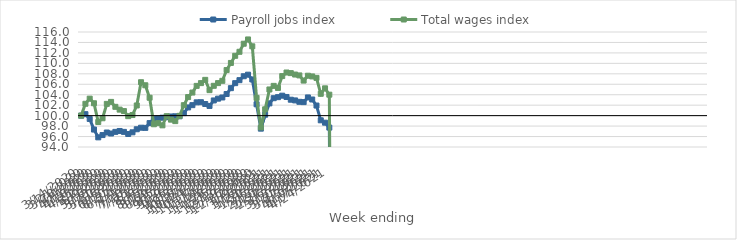
| Category | Payroll jobs index | Total wages index |
|---|---|---|
| 14/03/2020 | 100 | 100 |
| 21/03/2020 | 100.282 | 102.269 |
| 28/03/2020 | 99.367 | 103.251 |
| 04/04/2020 | 97.336 | 102.369 |
| 11/04/2020 | 95.846 | 98.784 |
| 18/04/2020 | 96.282 | 99.498 |
| 25/04/2020 | 96.773 | 102.247 |
| 02/05/2020 | 96.581 | 102.629 |
| 09/05/2020 | 96.894 | 101.685 |
| 16/05/2020 | 97.064 | 101.152 |
| 23/05/2020 | 96.892 | 100.875 |
| 30/05/2020 | 96.489 | 99.9 |
| 06/06/2020 | 96.811 | 100.114 |
| 13/06/2020 | 97.394 | 101.942 |
| 20/06/2020 | 97.689 | 106.393 |
| 27/06/2020 | 97.659 | 105.809 |
| 04/07/2020 | 98.572 | 103.425 |
| 11/07/2020 | 99.422 | 98.35 |
| 18/07/2020 | 99.469 | 98.569 |
| 25/07/2020 | 99.604 | 98.143 |
| 01/08/2020 | 99.696 | 99.895 |
| 08/08/2020 | 99.84 | 99.232 |
| 15/08/2020 | 99.872 | 98.951 |
| 22/08/2020 | 99.872 | 99.961 |
| 29/08/2020 | 100.479 | 101.997 |
| 05/09/2020 | 101.57 | 103.55 |
| 12/09/2020 | 102.008 | 104.418 |
| 19/09/2020 | 102.544 | 105.692 |
| 26/09/2020 | 102.569 | 106.22 |
| 03/10/2020 | 102.226 | 106.844 |
| 10/10/2020 | 101.856 | 104.88 |
| 17/10/2020 | 102.906 | 105.708 |
| 24/10/2020 | 103.246 | 106.225 |
| 31/10/2020 | 103.475 | 106.661 |
| 07/11/2020 | 104.14 | 108.717 |
| 14/11/2020 | 105.256 | 110.081 |
| 21/11/2020 | 106.216 | 111.446 |
| 28/11/2020 | 106.788 | 112.214 |
| 05/12/2020 | 107.536 | 113.757 |
| 12/12/2020 | 107.836 | 114.577 |
| 19/12/2020 | 106.922 | 113.26 |
| 26/12/2020 | 102.169 | 103.402 |
| 02/01/2021 | 97.51 | 97.746 |
| 09/01/2021 | 100.178 | 101.209 |
| 16/01/2021 | 102.344 | 105.007 |
| 23/01/2021 | 103.338 | 105.695 |
| 30/01/2021 | 103.537 | 105.3 |
| 06/02/2021 | 103.818 | 107.569 |
| 13/02/2021 | 103.571 | 108.251 |
| 20/02/2021 | 103.047 | 108.134 |
| 27/02/2021 | 102.912 | 107.863 |
| 06/03/2021 | 102.644 | 107.694 |
| 13/03/2021 | 102.59 | 106.705 |
| 20/03/2021 | 103.484 | 107.639 |
| 27/03/2021 | 103.087 | 107.501 |
| 03/04/2021 | 101.931 | 107.221 |
| 10/04/2021 | 99.104 | 104.175 |
| 17/04/2021 | 98.653 | 105.222 |
| 24/04/2021 | 97.712 | 104.009 |